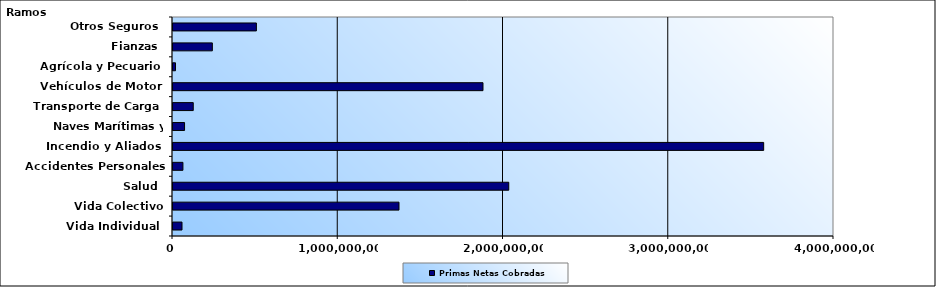
| Category | Primas Netas Cobradas |
|---|---|
| Vida Individual  | 54531151.7 |
| Vida Colectivo | 1367584029.41 |
| Salud  | 2031820207.84 |
| Accidentes Personales | 60103817.52 |
| Incendio y Aliados  | 3574440975.14 |
| Naves Marítimas y Aéreas  | 69925968.12 |
| Transporte de Carga  | 122576471.06 |
| Vehículos de Motor  | 1875909738.14 |
| Agrícola y Pecuario  | 15043987.96 |
| Fianzas  | 238129166.88 |
| Otros Seguros  | 504692810.61 |